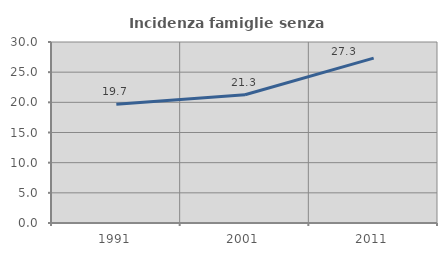
| Category | Incidenza famiglie senza nuclei |
|---|---|
| 1991.0 | 19.677 |
| 2001.0 | 21.25 |
| 2011.0 | 27.329 |